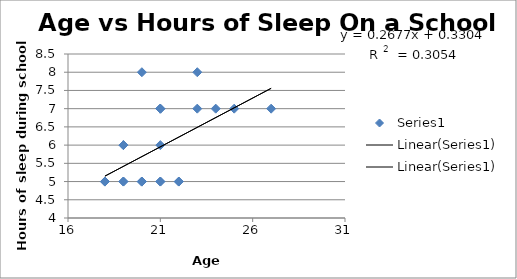
| Category | Series 0 |
|---|---|
| 21.0 | 7 |
| 19.0 | 6 |
| 22.0 | 5 |
| 21.0 | 7 |
| 18.0 | 5 |
| 20.0 | 5 |
| 20.0 | 5 |
| 21.0 | 7 |
| 25.0 | 7 |
| 21.0 | 6 |
| 24.0 | 7 |
| 19.0 | 5 |
| 18.0 | 5 |
| 27.0 | 7 |
| 20.0 | 8 |
| 19.0 | 6 |
| 21.0 | 5 |
| 22.0 | 5 |
| 23.0 | 7 |
| 23.0 | 8 |
| 21.0 | 5 |
| 20.0 | 5 |
| 18.0 | 5 |
| 19.0 | 5 |
| 20.0 | 5 |